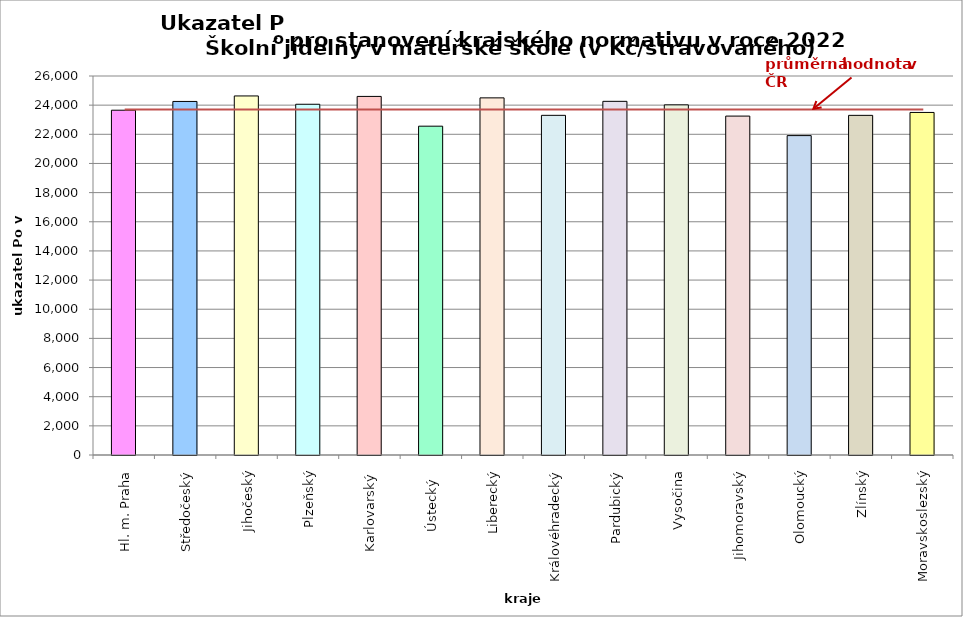
| Category | Series 0 |
|---|---|
| Hl. m. Praha | 23653 |
| Středočeský | 24254 |
| Jihočeský | 24632 |
| Plzeňský | 24061 |
| Karlovarský  | 24600 |
| Ústecký   | 22558 |
| Liberecký | 24500 |
| Královéhradecký | 23302 |
| Pardubický | 24262 |
| Vysočina | 24021 |
| Jihomoravský | 23250 |
| Olomoucký | 21911 |
| Zlínský | 23300 |
| Moravskoslezský | 23500 |